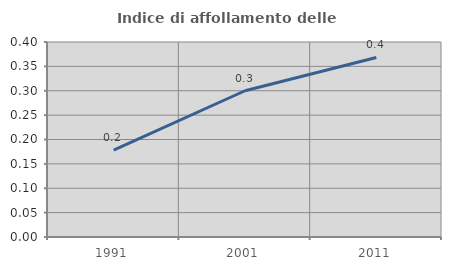
| Category | Indice di affollamento delle abitazioni  |
|---|---|
| 1991.0 | 0.178 |
| 2001.0 | 0.3 |
| 2011.0 | 0.368 |